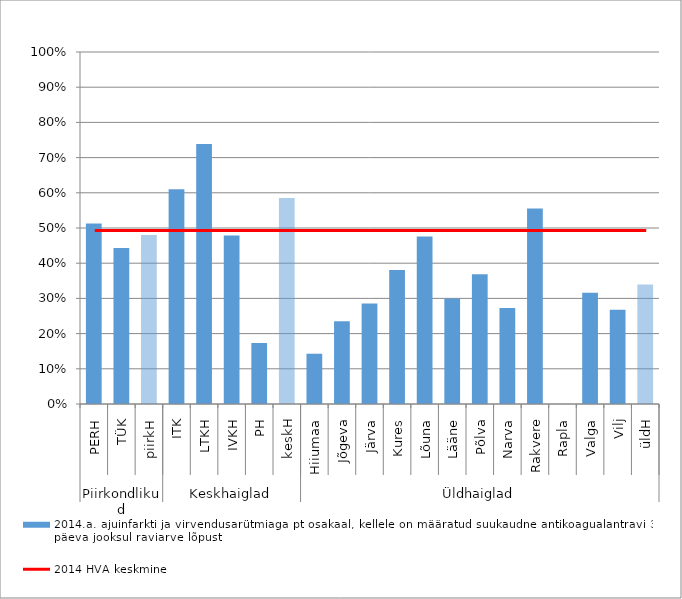
| Category | 2014.a. ajuinfarkti ja virvendusarütmiaga pt osakaal, kellele on määratud suukaudne antikoagualantravi 30 päeva jooksul raviarve lõpust |
|---|---|
| 0 | 0.513 |
| 1 | 0.443 |
| 2 | 0.48 |
| 3 | 0.61 |
| 4 | 0.739 |
| 5 | 0.479 |
| 6 | 0.173 |
| 7 | 0.585 |
| 8 | 0.143 |
| 9 | 0.235 |
| 10 | 0.286 |
| 11 | 0.381 |
| 12 | 0.476 |
| 13 | 0.3 |
| 14 | 0.368 |
| 15 | 0.273 |
| 16 | 0.556 |
| 17 | 0 |
| 18 | 0.316 |
| 19 | 0.268 |
| 20 | 0.34 |